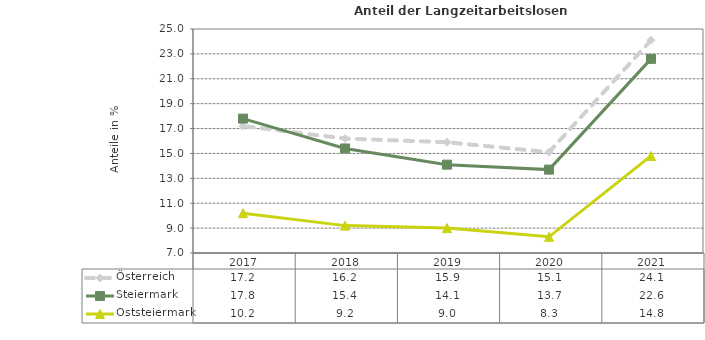
| Category | Österreich | Steiermark | Oststeiermark |
|---|---|---|---|
| 2021.0 | 24.1 | 22.6 | 14.8 |
| 2020.0 | 15.1 | 13.7 | 8.3 |
| 2019.0 | 15.9 | 14.1 | 9 |
| 2018.0 | 16.2 | 15.4 | 9.2 |
| 2017.0 | 17.2 | 17.8 | 10.2 |